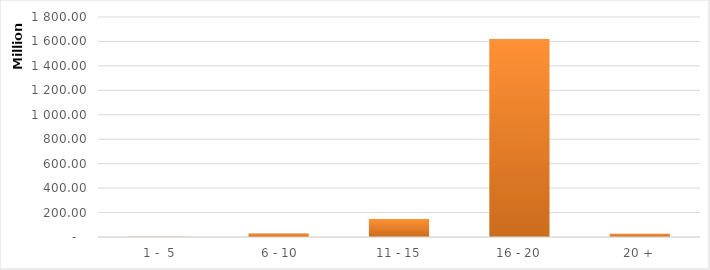
| Category | Series 0 |
|---|---|
|  1 -  5 | 2724475.14 |
|  6 - 10 | 27926844.42 |
| 11 - 15 | 146266775.2 |
| 16 - 20 | 1619403082.97 |
| 20 + | 27534330.42 |